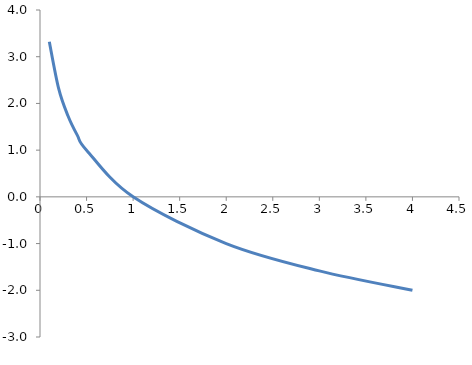
| Category | y |
|---|---|
| 0.1 | 3.322 |
| 0.2 | 2.322 |
| 0.3 | 1.737 |
| 0.4 | 1.322 |
| 0.5 | 1 |
| 1.0 | 0 |
| 2.0 | -1 |
| 3.0 | -1.585 |
| 4.0 | -2 |